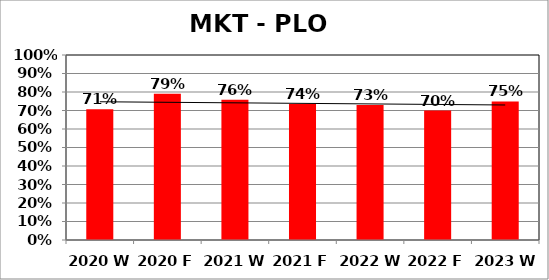
| Category | Series 0 |
|---|---|
| 2020 W | 0.707 |
| 2020 F | 0.79 |
| 2021 W | 0.758 |
| 2021 F | 0.735 |
| 2022 W | 0.73 |
| 2022 F | 0.7 |
| 2023 W | 0.749 |